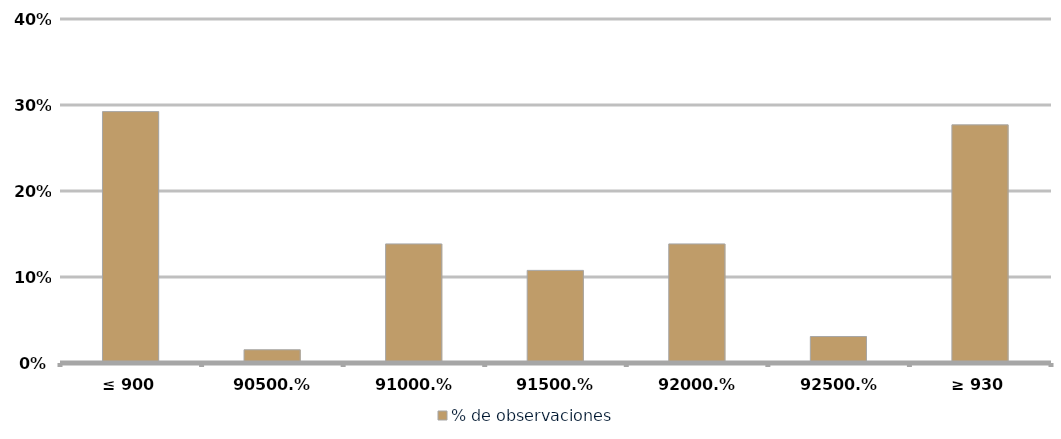
| Category | % de observaciones  |
|---|---|
| ≤ 900 | 0.292 |
| 905 | 0.015 |
| 910 | 0.138 |
| 915 | 0.108 |
| 920 | 0.138 |
| 925 | 0.031 |
| ≥ 930 | 0.277 |